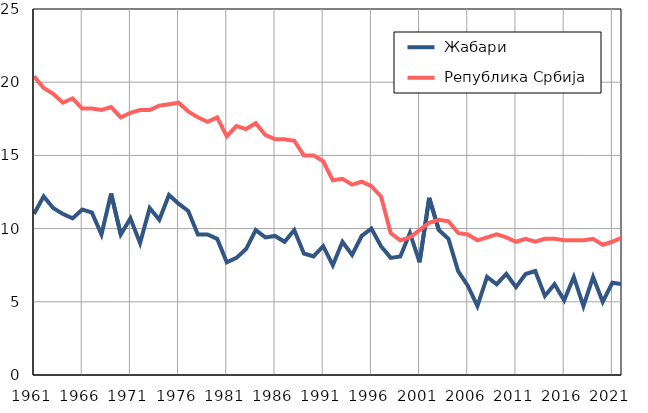
| Category |  Жабари |  Република Србија |
|---|---|---|
| 1961.0 | 11 | 20.4 |
| 1962.0 | 12.2 | 19.6 |
| 1963.0 | 11.4 | 19.2 |
| 1964.0 | 11 | 18.6 |
| 1965.0 | 10.7 | 18.9 |
| 1966.0 | 11.3 | 18.2 |
| 1967.0 | 11.1 | 18.2 |
| 1968.0 | 9.6 | 18.1 |
| 1969.0 | 12.4 | 18.3 |
| 1970.0 | 9.6 | 17.6 |
| 1971.0 | 10.7 | 17.9 |
| 1972.0 | 9 | 18.1 |
| 1973.0 | 11.4 | 18.1 |
| 1974.0 | 10.6 | 18.4 |
| 1975.0 | 12.3 | 18.5 |
| 1976.0 | 11.7 | 18.6 |
| 1977.0 | 11.2 | 18 |
| 1978.0 | 9.6 | 17.6 |
| 1979.0 | 9.6 | 17.3 |
| 1980.0 | 9.3 | 17.6 |
| 1981.0 | 7.7 | 16.3 |
| 1982.0 | 8 | 17 |
| 1983.0 | 8.6 | 16.8 |
| 1984.0 | 9.9 | 17.2 |
| 1985.0 | 9.4 | 16.4 |
| 1986.0 | 9.5 | 16.1 |
| 1987.0 | 9.1 | 16.1 |
| 1988.0 | 9.9 | 16 |
| 1989.0 | 8.3 | 15 |
| 1990.0 | 8.1 | 15 |
| 1991.0 | 8.8 | 14.6 |
| 1992.0 | 7.5 | 13.3 |
| 1993.0 | 9.1 | 13.4 |
| 1994.0 | 8.2 | 13 |
| 1995.0 | 9.5 | 13.2 |
| 1996.0 | 10 | 12.9 |
| 1997.0 | 8.8 | 12.2 |
| 1998.0 | 8 | 9.7 |
| 1999.0 | 8.1 | 9.2 |
| 2000.0 | 9.7 | 9.4 |
| 2001.0 | 7.7 | 9.9 |
| 2002.0 | 12.1 | 10.4 |
| 2003.0 | 9.9 | 10.6 |
| 2004.0 | 9.3 | 10.5 |
| 2005.0 | 7.1 | 9.7 |
| 2006.0 | 6.1 | 9.6 |
| 2007.0 | 4.7 | 9.2 |
| 2008.0 | 6.7 | 9.4 |
| 2009.0 | 6.2 | 9.6 |
| 2010.0 | 6.9 | 9.4 |
| 2011.0 | 6 | 9.1 |
| 2012.0 | 6.9 | 9.3 |
| 2013.0 | 7.1 | 9.1 |
| 2014.0 | 5.4 | 9.3 |
| 2015.0 | 6.2 | 9.3 |
| 2016.0 | 5.1 | 9.2 |
| 2017.0 | 6.7 | 9.2 |
| 2018.0 | 4.7 | 9.2 |
| 2019.0 | 6.7 | 9.3 |
| 2020.0 | 5 | 8.9 |
| 2021.0 | 6.3 | 9.1 |
| 2022.0 | 6.2 | 9.4 |